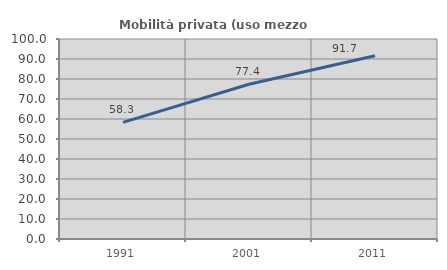
| Category | Mobilità privata (uso mezzo privato) |
|---|---|
| 1991.0 | 58.333 |
| 2001.0 | 77.381 |
| 2011.0 | 91.667 |